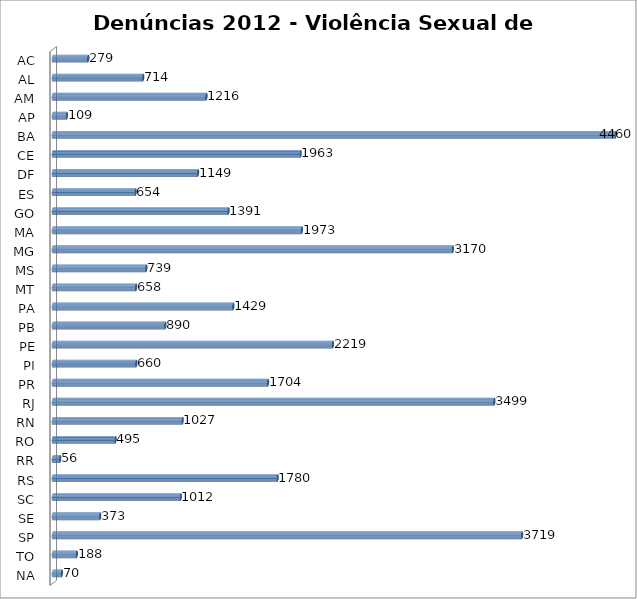
| Category | Series 0 |
|---|---|
| AC | 279 |
| AL | 714 |
| AM | 1216 |
| AP | 109 |
| BA | 4460 |
| CE | 1963 |
| DF | 1149 |
| ES | 654 |
| GO | 1391 |
| MA | 1973 |
| MG | 3170 |
| MS | 739 |
| MT | 658 |
| PA | 1429 |
| PB | 890 |
| PE | 2219 |
| PI | 660 |
| PR | 1704 |
| RJ | 3499 |
| RN | 1027 |
| RO | 495 |
| RR | 56 |
| RS | 1780 |
| SC | 1012 |
| SE | 373 |
| SP | 3719 |
| TO | 188 |
| NA | 70 |